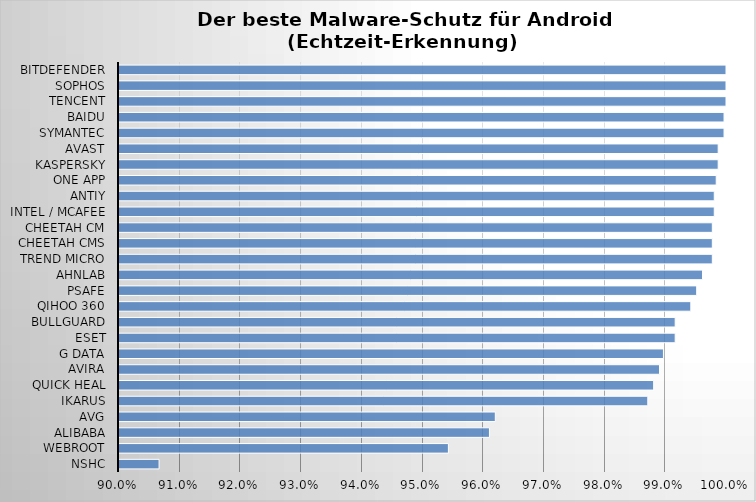
| Category | Series 0 |
|---|---|
| NSHC | 0.907 |
| Webroot | 0.954 |
| Alibaba | 0.961 |
| AVG | 0.962 |
| Ikarus | 0.987 |
| Quick Heal | 0.988 |
| Avira | 0.989 |
| G Data | 0.99 |
| ESET | 0.992 |
| BullGuard | 0.992 |
| Qihoo 360 | 0.994 |
| PSafe | 0.995 |
| AhnLab | 0.996 |
| Trend Micro | 0.998 |
| Cheetah CMS | 0.998 |
| Cheetah CM | 0.998 |
| Intel / McAfee | 0.998 |
| Antiy | 0.998 |
| ONE App | 0.998 |
| Kaspersky | 0.999 |
| Avast | 0.999 |
| Symantec | 1 |
| Baidu | 1 |
| Tencent | 1 |
| Sophos | 1 |
| Bitdefender | 1 |